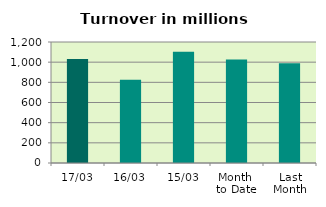
| Category | Series 0 |
|---|---|
| 17/03 | 1032.086 |
| 16/03 | 826.265 |
| 15/03 | 1102.095 |
| Month 
to Date | 1026.536 |
| Last
Month | 989.924 |